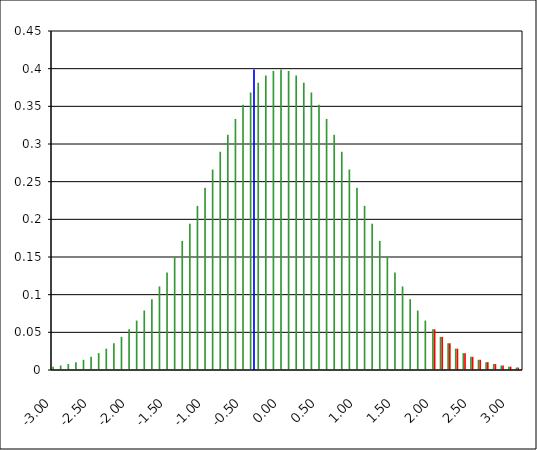
| Category | Series 1 | Series 0 | Series 2 |
|---|---|---|---|
| -3.0 | 0.004 | 0 | 0 |
| -2.9 | 0.006 | 0 | 0 |
| -2.8 | 0.008 | 0 | 0 |
| -2.6999999999999997 | 0.01 | 0 | 0 |
| -2.5999999999999996 | 0.014 | 0 | 0 |
| -2.4999999999999996 | 0.018 | 0 | 0 |
| -2.3999999999999995 | 0.022 | 0 | 0 |
| -2.2999999999999994 | 0.028 | 0 | 0 |
| -2.1999999999999993 | 0.035 | 0 | 0 |
| -2.099999999999999 | 0.044 | 0 | 0 |
| -1.9999999999999991 | 0.054 | 0 | 0 |
| -1.899999999999999 | 0.066 | 0 | 0 |
| -1.799999999999999 | 0.079 | 0 | 0 |
| -1.6999999999999988 | 0.094 | 0 | 0 |
| -1.5999999999999988 | 0.111 | 0 | 0 |
| -1.4999999999999987 | 0.13 | 0 | 0 |
| -1.3999999999999986 | 0.15 | 0 | 0 |
| -1.2999999999999985 | 0.171 | 0 | 0 |
| -1.1999999999999984 | 0.194 | 0 | 0 |
| -1.0999999999999983 | 0.218 | 0 | 0 |
| -0.9999999999999983 | 0.242 | 0 | 0 |
| -0.8999999999999984 | 0.266 | 0 | 0 |
| -0.7999999999999984 | 0.29 | 0 | 0 |
| -0.6999999999999984 | 0.312 | 0 | 0 |
| -0.5999999999999984 | 0.333 | 0 | 0 |
| -0.49999999999999845 | 0.352 | 0 | 0 |
| -0.39999999999999847 | 0.368 | 0 | 0.399 |
| -0.2999999999999985 | 0.381 | 0 | 0 |
| -0.19999999999999848 | 0.391 | 0 | 0 |
| -0.09999999999999848 | 0.397 | 0 | 0 |
| 1.5265566588595902e-15 | 0.399 | 0 | 0 |
| 0.10000000000000153 | 0.397 | 0 | 0 |
| 0.20000000000000154 | 0.391 | 0 | 0 |
| 0.30000000000000154 | 0.381 | 0 | 0 |
| 0.4000000000000016 | 0.368 | 0 | 0 |
| 0.5000000000000016 | 0.352 | 0 | 0 |
| 0.6000000000000015 | 0.333 | 0 | 0 |
| 0.7000000000000015 | 0.312 | 0 | 0 |
| 0.8000000000000015 | 0.29 | 0 | 0 |
| 0.9000000000000015 | 0.266 | 0 | 0 |
| 1.0000000000000016 | 0.242 | 0 | 0 |
| 1.1000000000000016 | 0.218 | 0 | 0 |
| 1.2000000000000017 | 0.194 | 0 | 0 |
| 1.3000000000000018 | 0.171 | 0 | 0 |
| 1.400000000000002 | 0.15 | 0 | 0 |
| 1.500000000000002 | 0.13 | 0 | 0 |
| 1.600000000000002 | 0.111 | 0 | 0 |
| 1.7000000000000022 | 0.094 | 0 | 0 |
| 1.8000000000000023 | 0.079 | 0 | 0 |
| 1.9000000000000024 | 0.066 | 0 | 0 |
| 2.000000000000002 | 0.054 | 0.054 | 0 |
| 2.1000000000000023 | 0.044 | 0.044 | 0 |
| 2.2000000000000024 | 0.035 | 0.035 | 0 |
| 2.3000000000000025 | 0.028 | 0.028 | 0 |
| 2.4000000000000026 | 0.022 | 0.022 | 0 |
| 2.5000000000000027 | 0.018 | 0.018 | 0 |
| 2.6000000000000028 | 0.014 | 0.014 | 0 |
| 2.700000000000003 | 0.01 | 0.01 | 0 |
| 2.800000000000003 | 0.008 | 0.008 | 0 |
| 2.900000000000003 | 0.006 | 0.006 | 0 |
| 3.000000000000003 | 0.004 | 0.004 | 0 |
| 3.100000000000003 | 0.003 | 0.003 | 0 |